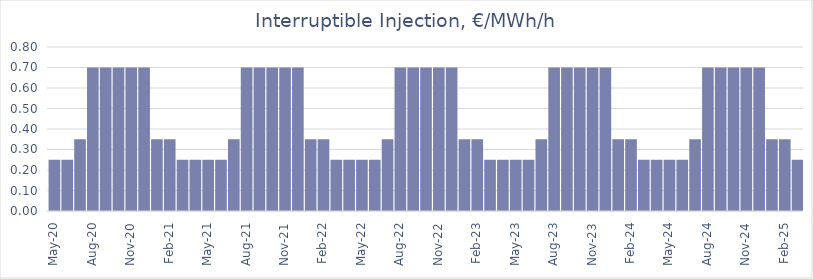
| Category | Price Pay-as-Used,  €/MWh/hour |
|---|---|
| 2020-05-01 | 0.25 |
| 2020-06-01 | 0.25 |
| 2020-07-01 | 0.35 |
| 2020-08-01 | 0.7 |
| 2020-09-01 | 0.7 |
| 2020-10-01 | 0.7 |
| 2020-11-01 | 0.7 |
| 2020-12-01 | 0.7 |
| 2021-01-01 | 0.35 |
| 2021-02-01 | 0.35 |
| 2021-03-01 | 0.25 |
| 2021-04-01 | 0.25 |
| 2021-05-01 | 0.25 |
| 2021-06-01 | 0.25 |
| 2021-07-01 | 0.35 |
| 2021-08-01 | 0.7 |
| 2021-09-01 | 0.7 |
| 2021-10-01 | 0.7 |
| 2021-11-01 | 0.7 |
| 2021-12-01 | 0.7 |
| 2022-01-01 | 0.35 |
| 2022-02-01 | 0.35 |
| 2022-03-01 | 0.25 |
| 2022-04-01 | 0.25 |
| 2022-05-01 | 0.25 |
| 2022-06-01 | 0.25 |
| 2022-07-01 | 0.35 |
| 2022-08-01 | 0.7 |
| 2022-09-01 | 0.7 |
| 2022-10-01 | 0.7 |
| 2022-11-01 | 0.7 |
| 2022-12-01 | 0.7 |
| 2023-01-01 | 0.35 |
| 2023-02-01 | 0.35 |
| 2023-03-01 | 0.25 |
| 2023-04-01 | 0.25 |
| 2023-05-01 | 0.25 |
| 2023-06-01 | 0.25 |
| 2023-07-01 | 0.35 |
| 2023-08-01 | 0.7 |
| 2023-09-01 | 0.7 |
| 2023-10-01 | 0.7 |
| 2023-11-01 | 0.7 |
| 2023-12-01 | 0.7 |
| 2024-01-01 | 0.35 |
| 2024-02-01 | 0.35 |
| 2024-03-01 | 0.25 |
| 2024-04-01 | 0.25 |
| 2024-05-01 | 0.25 |
| 2024-06-01 | 0.25 |
| 2024-07-01 | 0.35 |
| 2024-08-01 | 0.7 |
| 2024-09-01 | 0.7 |
| 2024-10-01 | 0.7 |
| 2024-11-01 | 0.7 |
| 2024-12-01 | 0.7 |
| 2025-01-01 | 0.35 |
| 2025-02-01 | 0.35 |
| 2025-03-01 | 0.25 |